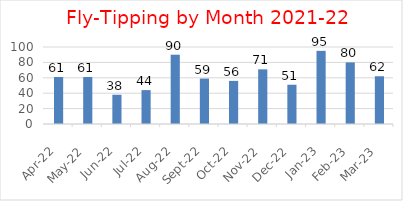
| Category | Series 0 |
|---|---|
| 2022-04-01 | 61 |
| 2022-05-01 | 61 |
| 2022-06-01 | 38 |
| 2022-07-01 | 44 |
| 2022-08-01 | 90 |
| 2022-09-01 | 59 |
| 2022-10-01 | 56 |
| 2022-11-01 | 71 |
| 2022-12-01 | 51 |
| 2023-01-01 | 95 |
| 2023-02-01 | 80 |
| 2023-03-01 | 62 |